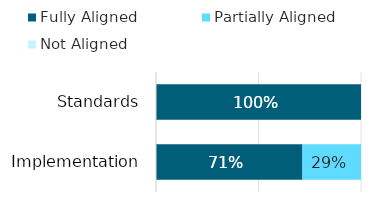
| Category | Fully Aligned | Partially Aligned | Not Aligned |
|---|---|---|---|
| Standards | 1 | 0 | 0 |
| Implementation | 0.714 | 0.286 | 0 |